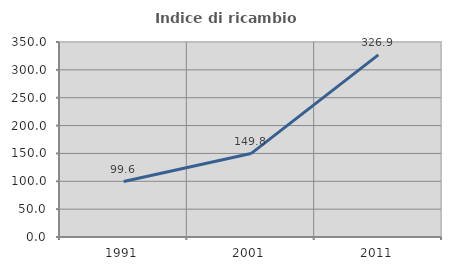
| Category | Indice di ricambio occupazionale  |
|---|---|
| 1991.0 | 99.598 |
| 2001.0 | 149.751 |
| 2011.0 | 326.914 |